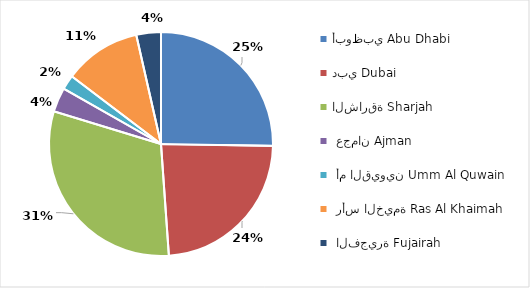
| Category | Series 0 |
|---|---|
| أبوظبي Abu Dhabi | 0.253 |
| دبي Dubai | 0.236 |
| الشارقة Sharjah | 0.308 |
|  عجمان Ajman | 0.035 |
|  أم القيوين Umm Al Quwain | 0.021 |
|  رأس الخيمة Ras Al Khaimah | 0.111 |
|  الفجيرة Fujairah | 0.036 |